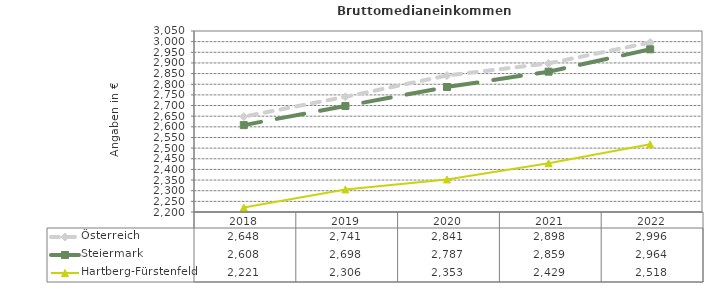
| Category | Österreich | Steiermark | Hartberg-Fürstenfeld |
|---|---|---|---|
| 2022.0 | 2996 | 2964 | 2518 |
| 2021.0 | 2898 | 2859 | 2429 |
| 2020.0 | 2841 | 2787 | 2353 |
| 2019.0 | 2741 | 2698 | 2306 |
| 2018.0 | 2648 | 2608 | 2221 |